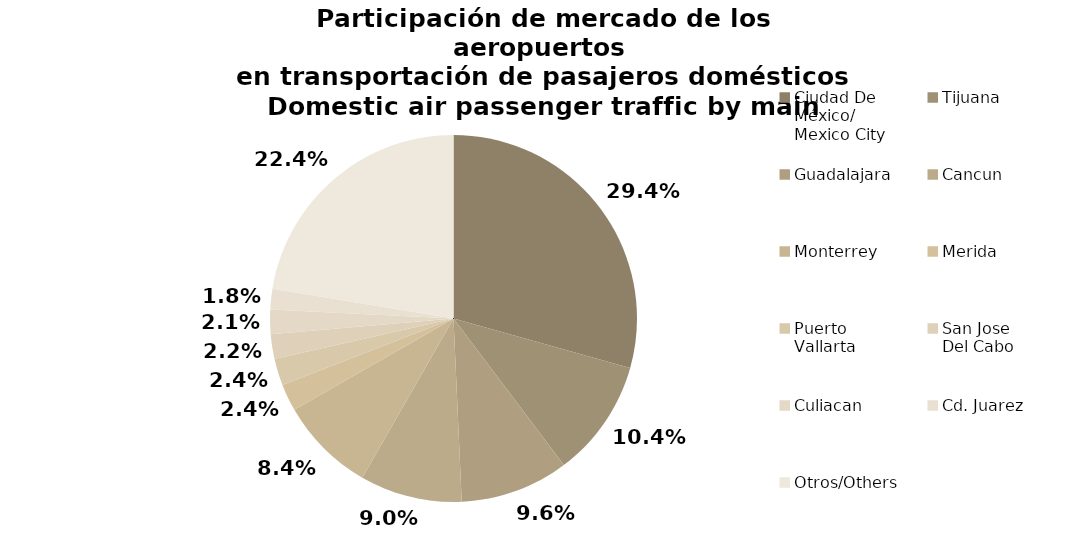
| Category | Series 0 |
|---|---|
| Ciudad De 
México/
Mexico City | 2860.006 |
| Tijuana | 1011.441 |
| Guadalajara | 930.973 |
| Cancun | 876.242 |
| Monterrey | 821.045 |
| Merida | 233.721 |
| Puerto 
Vallarta | 229.823 |
| San Jose 
Del Cabo | 211.734 |
| Culiacan | 209.648 |
| Cd. Juarez | 175.946 |
| Otros/Others | 2183.091 |